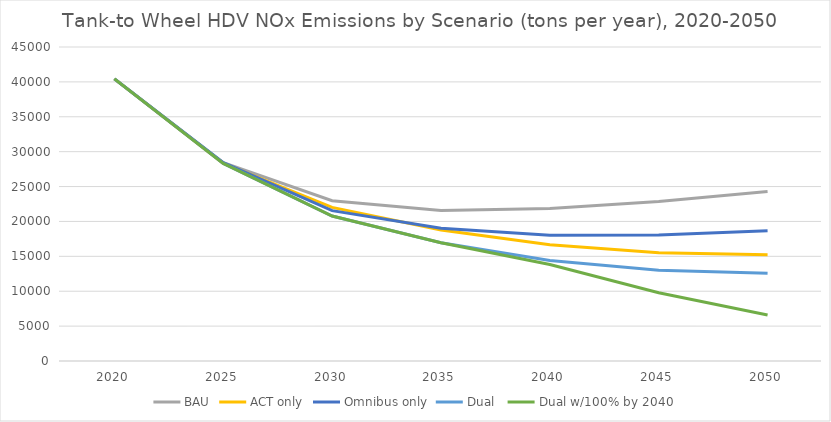
| Category | BAU | ACT only | Omnibus only | Dual  | Dual w/100% by 2040 |
|---|---|---|---|---|---|
| 2020.0 | 40423.343 | 40423.343 | 40423.343 | 40423.343 | 40423.343 |
| 2025.0 | 28418.8 | 28308.934 | 28418.8 | 28308.934 | 28308.934 |
| 2030.0 | 22980.213 | 22013.998 | 21545.371 | 20781.08 | 20781.08 |
| 2035.0 | 21579.893 | 18769.177 | 19028.959 | 16957.68 | 16957.68 |
| 2040.0 | 21848.006 | 16675.412 | 18034.601 | 14389.176 | 13832.33 |
| 2045.0 | 22855.996 | 15504.183 | 18058.243 | 13020.04 | 9778.962 |
| 2050.0 | 24302.953 | 15209.712 | 18679.531 | 12565.696 | 6599.206 |